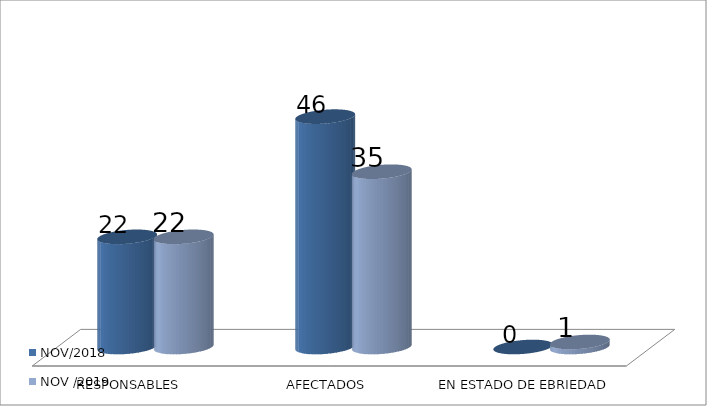
| Category | NOV/2018 | NOV /2019 |
|---|---|---|
| RESPONSABLES | 22 | 22 |
| AFECTADOS | 46 | 35 |
| EN ESTADO DE EBRIEDAD | 0 | 1 |